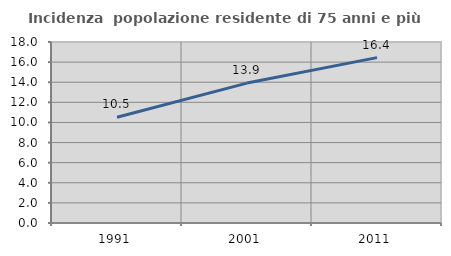
| Category | Incidenza  popolazione residente di 75 anni e più |
|---|---|
| 1991.0 | 10.516 |
| 2001.0 | 13.915 |
| 2011.0 | 16.447 |